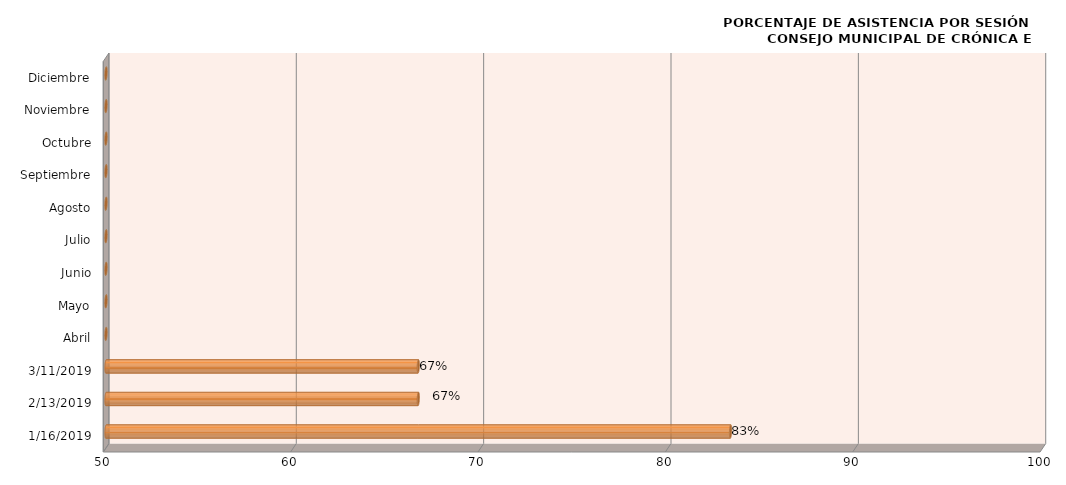
| Category | Series 0 |
|---|---|
| 16/01/2019 | 83.333 |
| 13/02/2019 | 66.667 |
| 11/03/2019 | 66.667 |
| Abril | 0 |
| Mayo | 0 |
| Junio | 0 |
| Julio | 0 |
| Agosto | 0 |
| Septiembre | 0 |
| Octubre | 0 |
| Noviembre | 0 |
| Diciembre | 0 |